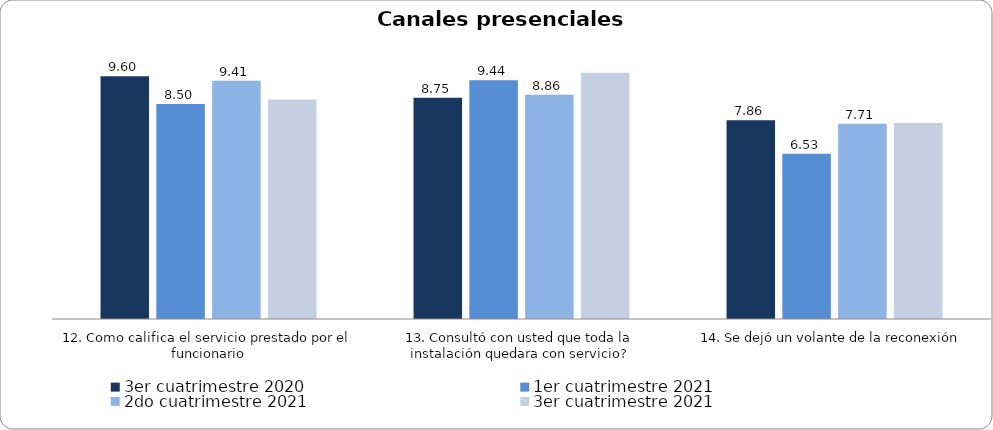
| Category | 3er cuatrimestre 2020 | Septiembre - Octubre 2018 | 1er cuatrimestre 2021 | Noviembre - Diciembre 2018 | 1er cuatrimestre 2019 | 2do cuatrimestre 2019 | 2do cuatrimestre 2021 | 3er cuatrimestre 2021 |
|---|---|---|---|---|---|---|---|---|
| 12. Como califica el servicio prestado por el funcionario | 9.596 |  | 8.496 |  |  |  | 9.412 | 8.68 |
| 13. Consultó con usted que toda la instalación quedara con servicio? | 8.75 |  | 9.437 |  |  |  | 8.86 | 9.737 |
| 14. Se dejó un volante de la reconexión | 7.857 |  | 6.528 |  |  |  | 7.714 | 7.75 |